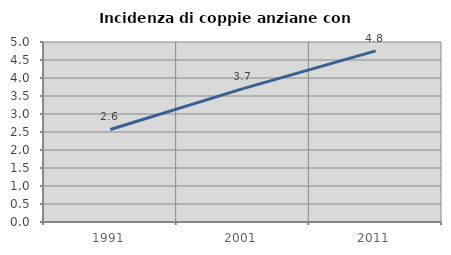
| Category | Incidenza di coppie anziane con figli |
|---|---|
| 1991.0 | 2.57 |
| 2001.0 | 3.704 |
| 2011.0 | 4.754 |